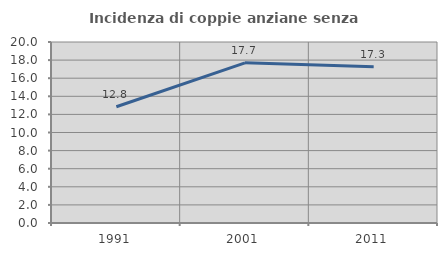
| Category | Incidenza di coppie anziane senza figli  |
|---|---|
| 1991.0 | 12.844 |
| 2001.0 | 17.696 |
| 2011.0 | 17.254 |